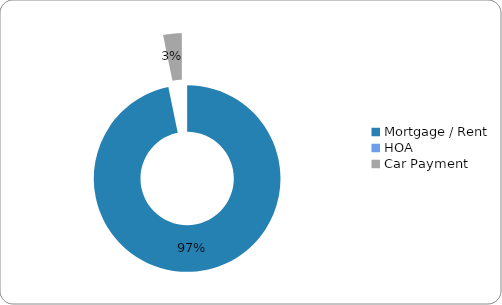
| Category | Series 0 |
|---|---|
| Mortgage / Rent | 3000 |
| HOA | 0 |
| Car Payment | 100 |